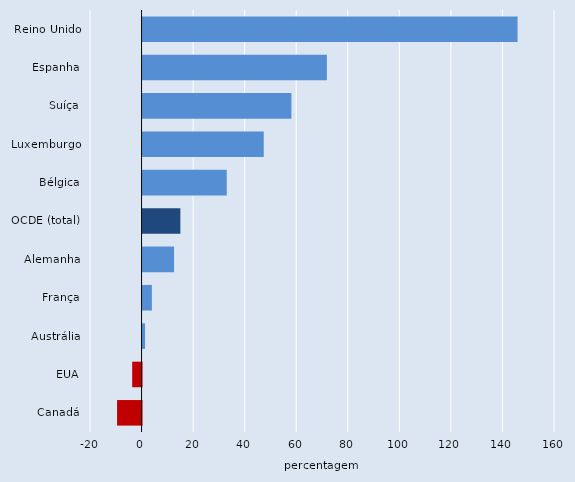
| Category | Series 0 |
|---|---|
| Reino Unido | 145.479 |
| Espanha | 71.509 |
| Suíça | 57.744 |
| Luxemburgo | 47.013 |
| Bélgica | 32.652 |
| OCDE (total) | 14.666 |
| Alemanha | 12.227 |
| França | 3.615 |
| Austrália | 0.969 |
| EUA | -3.632 |
| Canadá | -9.494 |